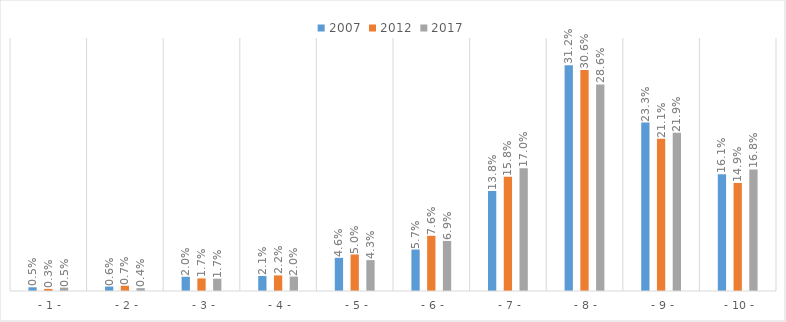
| Category | 2007 | 2012 | 2017 |
|---|---|---|---|
|  - 1 - | 0.005 | 0.003 | 0.005 |
|  - 2 - | 0.006 | 0.007 | 0.004 |
|  - 3 - | 0.02 | 0.017 | 0.017 |
|  - 4 - | 0.021 | 0.022 | 0.02 |
|  - 5 - | 0.046 | 0.05 | 0.043 |
|  - 6 - | 0.057 | 0.076 | 0.069 |
|  - 7 - | 0.138 | 0.158 | 0.17 |
|  - 8 - | 0.312 | 0.306 | 0.286 |
|  - 9 - | 0.233 | 0.211 | 0.219 |
|  - 10 - | 0.161 | 0.149 | 0.168 |